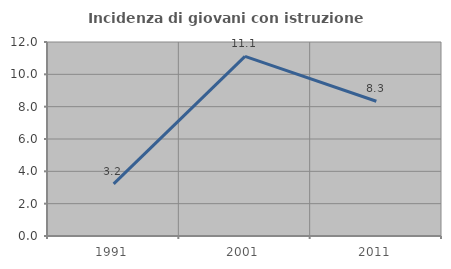
| Category | Incidenza di giovani con istruzione universitaria |
|---|---|
| 1991.0 | 3.226 |
| 2001.0 | 11.111 |
| 2011.0 | 8.333 |